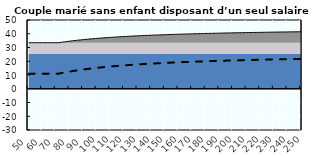
| Category | Coin fiscal moyen (somme des composantes) | Taux moyen d'imposition net en % du salaire brut |
|---|---|---|
| 50.0 | 33.483 | 11 |
| 51.0 | 33.483 | 11 |
| 52.0 | 33.483 | 11 |
| 53.0 | 33.483 | 11 |
| 54.0 | 33.483 | 11 |
| 55.0 | 33.483 | 11 |
| 56.0 | 33.483 | 11 |
| 57.0 | 33.483 | 11 |
| 58.0 | 33.483 | 11 |
| 59.0 | 33.483 | 11 |
| 60.0 | 33.483 | 11 |
| 61.0 | 33.483 | 11 |
| 62.0 | 33.483 | 11 |
| 63.0 | 33.483 | 11 |
| 64.0 | 33.483 | 11 |
| 65.0 | 33.483 | 11 |
| 66.0 | 33.483 | 11 |
| 67.0 | 33.483 | 11 |
| 68.0 | 33.483 | 11 |
| 69.0 | 33.483 | 11 |
| 70.0 | 33.483 | 11 |
| 71.0 | 33.483 | 11 |
| 72.0 | 33.483 | 11 |
| 73.0 | 33.629 | 11.196 |
| 74.0 | 33.779 | 11.396 |
| 75.0 | 33.924 | 11.591 |
| 76.0 | 34.066 | 11.78 |
| 77.0 | 34.204 | 11.965 |
| 78.0 | 34.338 | 12.145 |
| 79.0 | 34.469 | 12.32 |
| 80.0 | 34.597 | 12.491 |
| 81.0 | 34.722 | 12.658 |
| 82.0 | 34.844 | 12.821 |
| 83.0 | 34.962 | 12.979 |
| 84.0 | 35.078 | 13.134 |
| 85.0 | 35.191 | 13.286 |
| 86.0 | 35.302 | 13.434 |
| 87.0 | 35.41 | 13.578 |
| 88.0 | 35.515 | 13.719 |
| 89.0 | 35.618 | 13.857 |
| 90.0 | 35.719 | 13.992 |
| 91.0 | 35.818 | 14.124 |
| 92.0 | 35.914 | 14.253 |
| 93.0 | 36.009 | 14.38 |
| 94.0 | 36.101 | 14.503 |
| 95.0 | 36.191 | 14.624 |
| 96.0 | 36.28 | 14.743 |
| 97.0 | 36.367 | 14.859 |
| 98.0 | 36.452 | 14.972 |
| 99.0 | 36.535 | 15.084 |
| 100.0 | 36.617 | 15.193 |
| 101.0 | 36.697 | 15.3 |
| 102.0 | 36.775 | 15.405 |
| 103.0 | 36.852 | 15.508 |
| 104.0 | 36.927 | 15.609 |
| 105.0 | 37.001 | 15.708 |
| 106.0 | 37.074 | 15.805 |
| 107.0 | 37.145 | 15.9 |
| 108.0 | 37.215 | 15.993 |
| 109.0 | 37.283 | 16.085 |
| 110.0 | 37.351 | 16.175 |
| 111.0 | 37.417 | 16.264 |
| 112.0 | 37.482 | 16.351 |
| 113.0 | 37.546 | 16.436 |
| 114.0 | 37.608 | 16.52 |
| 115.0 | 37.67 | 16.603 |
| 116.0 | 37.731 | 16.684 |
| 117.0 | 37.79 | 16.763 |
| 118.0 | 37.849 | 16.841 |
| 119.0 | 37.906 | 16.918 |
| 120.0 | 37.963 | 16.994 |
| 121.0 | 38.018 | 17.069 |
| 122.0 | 38.073 | 17.142 |
| 123.0 | 38.127 | 17.214 |
| 124.0 | 38.18 | 17.285 |
| 125.0 | 38.232 | 17.354 |
| 126.0 | 38.283 | 17.423 |
| 127.0 | 38.334 | 17.491 |
| 128.0 | 38.383 | 17.557 |
| 129.0 | 38.432 | 17.622 |
| 130.0 | 38.48 | 17.687 |
| 131.0 | 38.528 | 17.75 |
| 132.0 | 38.575 | 17.813 |
| 133.0 | 38.621 | 17.874 |
| 134.0 | 38.666 | 17.935 |
| 135.0 | 38.711 | 17.995 |
| 136.0 | 38.755 | 18.054 |
| 137.0 | 38.798 | 18.112 |
| 138.0 | 38.841 | 18.169 |
| 139.0 | 38.883 | 18.225 |
| 140.0 | 38.924 | 18.281 |
| 141.0 | 38.965 | 18.335 |
| 142.0 | 39.006 | 18.389 |
| 143.0 | 39.045 | 18.443 |
| 144.0 | 39.085 | 18.495 |
| 145.0 | 39.123 | 18.547 |
| 146.0 | 39.161 | 18.598 |
| 147.0 | 39.199 | 18.648 |
| 148.0 | 39.236 | 18.698 |
| 149.0 | 39.273 | 18.747 |
| 150.0 | 39.309 | 18.795 |
| 151.0 | 39.345 | 18.843 |
| 152.0 | 39.38 | 18.89 |
| 153.0 | 39.414 | 18.937 |
| 154.0 | 39.449 | 18.982 |
| 155.0 | 39.483 | 19.028 |
| 156.0 | 39.516 | 19.072 |
| 157.0 | 39.549 | 19.117 |
| 158.0 | 39.582 | 19.16 |
| 159.0 | 39.614 | 19.203 |
| 160.0 | 39.645 | 19.246 |
| 161.0 | 39.677 | 19.288 |
| 162.0 | 39.708 | 19.329 |
| 163.0 | 39.738 | 19.37 |
| 164.0 | 39.769 | 19.41 |
| 165.0 | 39.798 | 19.45 |
| 166.0 | 39.828 | 19.49 |
| 167.0 | 39.857 | 19.529 |
| 168.0 | 39.886 | 19.567 |
| 169.0 | 39.914 | 19.605 |
| 170.0 | 39.942 | 19.643 |
| 171.0 | 39.97 | 19.68 |
| 172.0 | 39.998 | 19.717 |
| 173.0 | 40.025 | 19.753 |
| 174.0 | 40.052 | 19.789 |
| 175.0 | 40.078 | 19.825 |
| 176.0 | 40.104 | 19.86 |
| 177.0 | 40.13 | 19.894 |
| 178.0 | 40.156 | 19.929 |
| 179.0 | 40.181 | 19.963 |
| 180.0 | 40.206 | 19.996 |
| 181.0 | 40.231 | 20.029 |
| 182.0 | 40.256 | 20.062 |
| 183.0 | 40.28 | 20.095 |
| 184.0 | 40.304 | 20.127 |
| 185.0 | 40.328 | 20.158 |
| 186.0 | 40.351 | 20.19 |
| 187.0 | 40.374 | 20.221 |
| 188.0 | 40.397 | 20.252 |
| 189.0 | 40.42 | 20.282 |
| 190.0 | 40.443 | 20.312 |
| 191.0 | 40.465 | 20.342 |
| 192.0 | 40.487 | 20.371 |
| 193.0 | 40.509 | 20.4 |
| 194.0 | 40.53 | 20.429 |
| 195.0 | 40.552 | 20.458 |
| 196.0 | 40.573 | 20.486 |
| 197.0 | 40.594 | 20.514 |
| 198.0 | 40.614 | 20.542 |
| 199.0 | 40.635 | 20.569 |
| 200.0 | 40.655 | 20.596 |
| 201.0 | 40.675 | 20.623 |
| 202.0 | 40.695 | 20.65 |
| 203.0 | 40.715 | 20.676 |
| 204.0 | 40.734 | 20.702 |
| 205.0 | 40.754 | 20.728 |
| 206.0 | 40.773 | 20.754 |
| 207.0 | 40.792 | 20.779 |
| 208.0 | 40.81 | 20.804 |
| 209.0 | 40.829 | 20.829 |
| 210.0 | 40.847 | 20.854 |
| 211.0 | 40.866 | 20.878 |
| 212.0 | 40.884 | 20.902 |
| 213.0 | 40.902 | 20.926 |
| 214.0 | 40.919 | 20.95 |
| 215.0 | 40.937 | 20.973 |
| 216.0 | 40.954 | 20.997 |
| 217.0 | 40.971 | 21.02 |
| 218.0 | 40.989 | 21.043 |
| 219.0 | 41.005 | 21.065 |
| 220.0 | 41.022 | 21.088 |
| 221.0 | 41.039 | 21.11 |
| 222.0 | 41.055 | 21.132 |
| 223.0 | 41.072 | 21.154 |
| 224.0 | 41.088 | 21.175 |
| 225.0 | 41.104 | 21.197 |
| 226.0 | 41.12 | 21.218 |
| 227.0 | 41.135 | 21.239 |
| 228.0 | 41.151 | 21.26 |
| 229.0 | 41.166 | 21.281 |
| 230.0 | 41.182 | 21.301 |
| 231.0 | 41.197 | 21.322 |
| 232.0 | 41.212 | 21.342 |
| 233.0 | 41.227 | 21.362 |
| 234.0 | 41.242 | 21.382 |
| 235.0 | 41.257 | 21.401 |
| 236.0 | 41.271 | 21.421 |
| 237.0 | 41.286 | 21.44 |
| 238.0 | 41.3 | 21.459 |
| 239.0 | 41.314 | 21.478 |
| 240.0 | 41.328 | 21.497 |
| 241.0 | 41.342 | 21.516 |
| 242.0 | 41.356 | 21.534 |
| 243.0 | 41.37 | 21.553 |
| 244.0 | 41.383 | 21.571 |
| 245.0 | 41.397 | 21.589 |
| 246.0 | 41.41 | 21.607 |
| 247.0 | 41.424 | 21.625 |
| 248.0 | 41.437 | 21.642 |
| 249.0 | 41.45 | 21.66 |
| 250.0 | 41.463 | 21.677 |